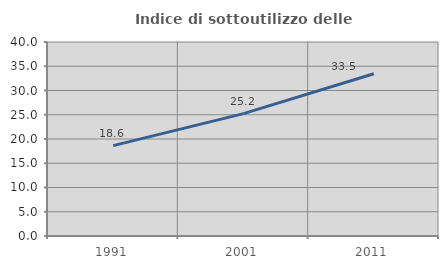
| Category | Indice di sottoutilizzo delle abitazioni  |
|---|---|
| 1991.0 | 18.638 |
| 2001.0 | 25.228 |
| 2011.0 | 33.464 |